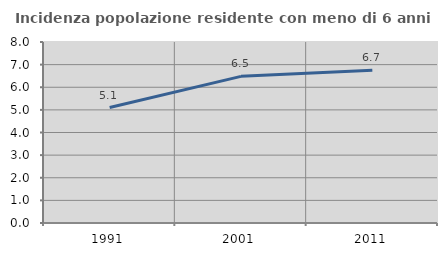
| Category | Incidenza popolazione residente con meno di 6 anni |
|---|---|
| 1991.0 | 5.104 |
| 2001.0 | 6.482 |
| 2011.0 | 6.747 |